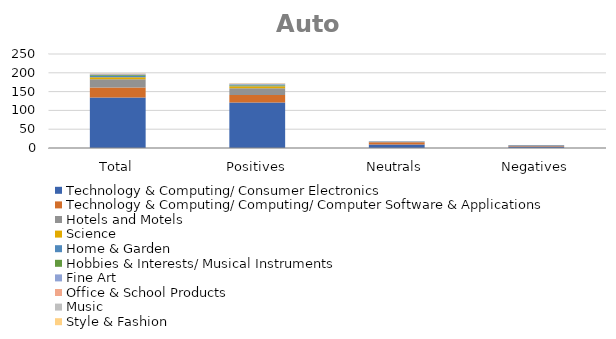
| Category | Technology & Computing/ Consumer Electronics | Technology & Computing/ Computing/ Computer Software & Applications | Hotels and Motels | Science | Home & Garden | Hobbies & Interests/ Musical Instruments | Fine Art | Office & School Products | Music | Style & Fashion |
|---|---|---|---|---|---|---|---|---|---|---|
| Total | 134 | 27 | 22 | 5 | 4 | 2 | 2 | 1 | 1 | 1 |
| Positives | 121 | 20 | 18 | 5 | 2 | 2 | 2 | 1 | 1 | 1 |
| Neutrals | 9 | 6 | 2 | 0 | 1 | 0 | 0 | 0 | 0 | 0 |
| Negatives | 4 | 1 | 2 | 0 | 1 | 0 | 0 | 0 | 0 | 0 |